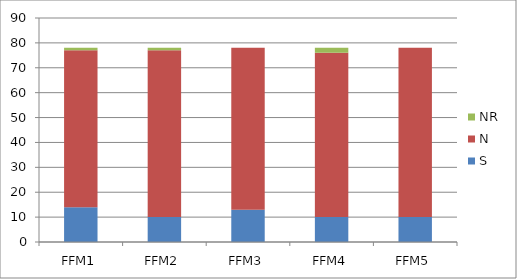
| Category | S | N | NR |
|---|---|---|---|
| FFM1 | 14 | 63 | 1 |
| FFM2 | 10 | 67 | 1 |
| FFM3 | 13 | 65 | 0 |
| FFM4 | 10 | 66 | 2 |
| FFM5 | 10 | 68 | 0 |